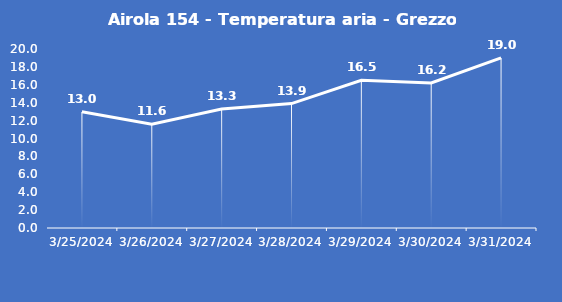
| Category | Airola 154 - Temperatura aria - Grezzo (°C) |
|---|---|
| 3/25/24 | 13 |
| 3/26/24 | 11.6 |
| 3/27/24 | 13.3 |
| 3/28/24 | 13.9 |
| 3/29/24 | 16.5 |
| 3/30/24 | 16.2 |
| 3/31/24 | 19 |